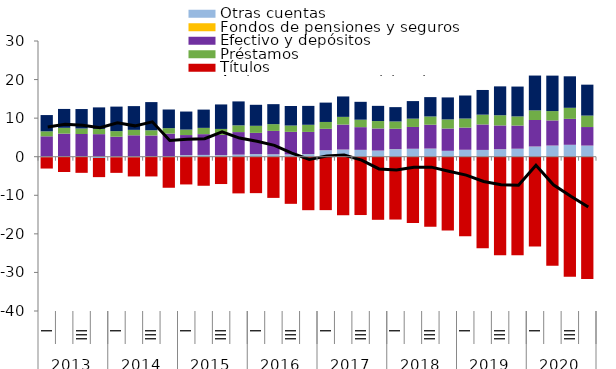
| Category | Otras cuentas | Fondos de pensiones y seguros | Efectivo y depósitos | Préstamos  | Títulos | Acciones y otras participaciones  |
|---|---|---|---|---|---|---|
| 0 | -0.115 | 0.013 | 5.276 | 1.29 | -2.953 | 4.221 |
| 1 | -0.027 | 0.013 | 5.971 | 1.513 | -3.936 | 4.891 |
| 2 | -0.043 | 0.013 | 5.872 | 1.438 | -4.135 | 5.039 |
| 3 | -0.327 | 0.013 | 5.837 | 1.36 | -4.966 | 5.577 |
| 4 | -0.132 | 0.013 | 5.172 | 1.448 | -4.054 | 6.358 |
| 5 | -0.132 | 0.014 | 5.54 | 1.406 | -4.986 | 6.16 |
| 6 | 0.046 | 0.014 | 5.444 | 1.351 | -5.114 | 7.305 |
| 7 | -0.094 | 0.014 | 5.98 | 1.413 | -7.954 | 4.834 |
| 8 | 0.406 | 0.014 | 5.194 | 1.419 | -7.188 | 4.678 |
| 9 | 0.449 | 0.014 | 5.386 | 1.629 | -7.533 | 4.738 |
| 10 | 0.398 | 0.015 | 5.244 | 1.545 | -7.083 | 6.351 |
| 11 | 0.526 | 0.014 | 5.846 | 1.743 | -9.508 | 6.209 |
| 12 | 0.671 | 0.014 | 5.498 | 1.834 | -9.443 | 5.443 |
| 13 | 0.621 | 0.014 | 6.056 | 1.756 | -10.677 | 5.179 |
| 14 | 0.585 | 0.014 | 5.845 | 1.641 | -12.215 | 5.066 |
| 15 | 0.671 | 0.014 | 5.744 | 1.85 | -13.865 | 4.898 |
| 16 | 1.66 | 0.014 | 5.557 | 1.779 | -13.851 | 5.02 |
| 17 | 1.844 | 0.014 | 6.476 | 1.997 | -15.173 | 5.293 |
| 18 | 1.767 | 0.014 | 5.885 | 1.932 | -15.122 | 4.636 |
| 19 | 1.583 | 0.014 | 5.727 | 1.923 | -16.355 | 3.939 |
| 20 | 1.96 | 0.014 | 5.273 | 1.888 | -16.289 | 3.719 |
| 21 | 2.049 | 0.014 | 5.65 | 2.158 | -17.165 | 4.551 |
| 22 | 2.101 | 0.014 | 6.177 | 2.142 | -18.158 | 5.018 |
| 23 | 1.517 | 0.015 | 5.779 | 2.36 | -19.128 | 5.703 |
| 24 | 1.786 | 0.015 | 5.753 | 2.344 | -20.637 | 5.971 |
| 25 | 1.747 | 0.015 | 6.603 | 2.539 | -23.738 | 6.401 |
| 26 | 1.933 | 0.015 | 6.162 | 2.638 | -25.523 | 7.488 |
| 27 | 2.06 | 0.016 | 5.999 | 2.375 | -25.573 | 7.739 |
| 28 | 2.634 | 0.016 | 6.866 | 2.495 | -23.266 | 9.031 |
| 29 | 2.882 | 0.015 | 6.511 | 2.428 | -28.296 | 9.188 |
| 30 | 3.075 | 0.015 | 6.719 | 2.873 | -31.117 | 8.164 |
| 31 | 2.871 | 0.015 | 4.808 | 2.966 | -31.728 | 8.02 |